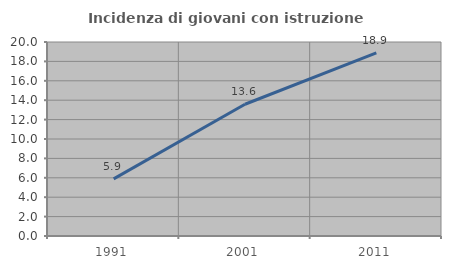
| Category | Incidenza di giovani con istruzione universitaria |
|---|---|
| 1991.0 | 5.894 |
| 2001.0 | 13.583 |
| 2011.0 | 18.873 |